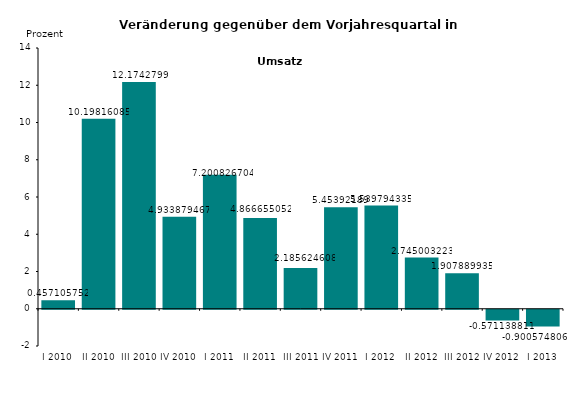
| Category | Series 0 |
|---|---|
| I 2010 | 0.457 |
| II 2010 | 10.198 |
| III 2010 | 12.174 |
| IV 2010 | 4.934 |
| I 2011 | 7.201 |
| II 2011 | 4.867 |
| III 2011 | 2.186 |
| IV 2011 | 5.454 |
| I 2012 | 5.54 |
| II 2012 | 2.745 |
| III 2012 | 1.908 |
| IV 2012 | -0.571 |
| I 2013 | -0.901 |